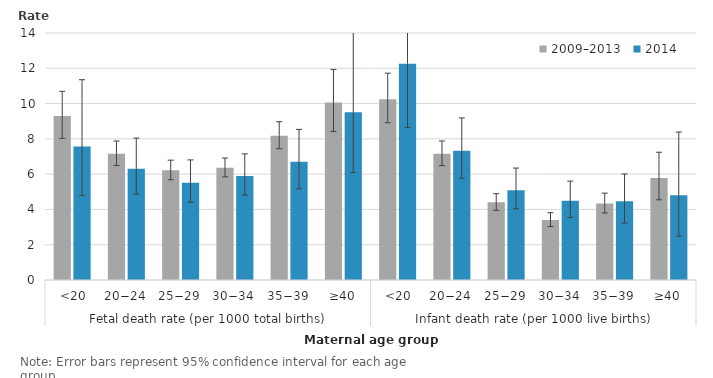
| Category | 2009–2013 | 2014 |
|---|---|---|
| 0 | 9.289 | 7.566 |
| 1 | 7.157 | 6.311 |
| 2 | 6.218 | 5.511 |
| 3 | 6.363 | 5.893 |
| 4 | 8.18 | 6.698 |
| 5 | 10.066 | 9.509 |
| 6 | 10.246 | 12.264 |
| 7 | 7.156 | 7.328 |
| 8 | 4.4 | 5.091 |
| 9 | 3.402 | 4.489 |
| 10 | 4.335 | 4.461 |
| 11 | 5.777 | 4.8 |